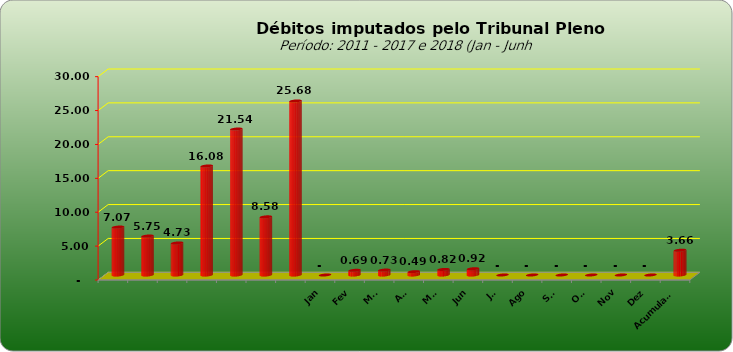
| Category |  7.073.154,74  |
|---|---|
|  | 7073154.74 |
|  | 5749129.25 |
|  | 4727033.51 |
|  | 16081820.48 |
|  | 21535723.6 |
|  | 8578266.09 |
|  | 25676499.17 |
| Jan | 0 |
| Fev | 689867.86 |
| Mar | 729624.1 |
| Abr | 491509.68 |
| Mai | 824303.32 |
| Jun | 924019.84 |
| Jul | 0 |
| Ago | 0 |
| Set | 0 |
| Out | 0 |
| Nov | 0 |
| Dez | 0 |
| Acumulado | 3656692.35 |